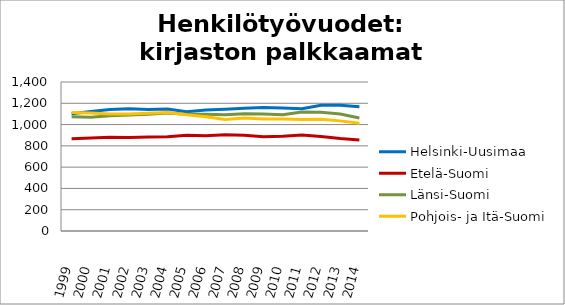
| Category | Helsinki-Uusimaa | Etelä-Suomi | Länsi-Suomi | Pohjois- ja Itä-Suomi |
|---|---|---|---|---|
| 1999.0 | 1101.5 | 867.8 | 1074 | 1113.2 |
| 2000.0 | 1122.6 | 874.6 | 1069.6 | 1108 |
| 2001.0 | 1142.25 | 880.97 | 1082.95 | 1098.57 |
| 2002.0 | 1148.84 | 877.57 | 1090.52 | 1100.49 |
| 2003.0 | 1141.86 | 884.19 | 1096.31 | 1107.21 |
| 2004.0 | 1145.51 | 886.59 | 1107.98 | 1113.94 |
| 2005.0 | 1120.45 | 900.69 | 1097 | 1092.09 |
| 2006.0 | 1135.78 | 894.54 | 1097.78 | 1073.83 |
| 2007.0 | 1143.69 | 903.42 | 1092.97 | 1046.97 |
| 2008.0 | 1154.31 | 899.14 | 1101.99 | 1062.27 |
| 2009.0 | 1159.76 | 886.38 | 1098.53 | 1052.86 |
| 2010.0 | 1156.51 | 890.83 | 1092.71 | 1052.37 |
| 2011.0 | 1149.74 | 901.01 | 1117.81 | 1047.52 |
| 2012.0 | 1181.34 | 886.85 | 1115.62 | 1049.91 |
| 2013.0 | 1182.43 | 868.3 | 1098.62 | 1034.71 |
| 2014.0 | 1167.6 | 855.39 | 1061.62 | 1012.01 |